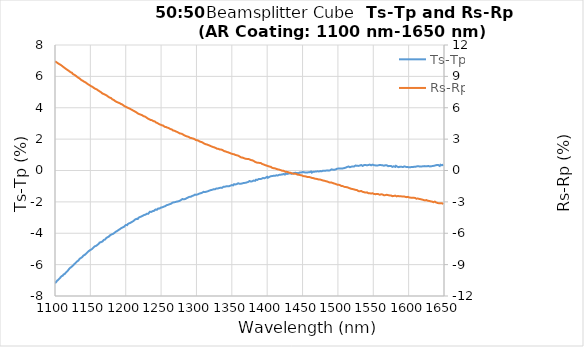
| Category | Ts-Tp |
|---|---|
| 1100.0 | -7.181 |
| 1101.0 | -7.12 |
| 1102.0 | -7.091 |
| 1103.0 | -7.024 |
| 1104.0 | -6.999 |
| 1105.0 | -6.949 |
| 1106.0 | -6.905 |
| 1107.0 | -6.854 |
| 1108.0 | -6.821 |
| 1109.0 | -6.749 |
| 1110.0 | -6.731 |
| 1111.0 | -6.701 |
| 1112.0 | -6.631 |
| 1113.0 | -6.587 |
| 1114.0 | -6.583 |
| 1115.0 | -6.534 |
| 1116.0 | -6.476 |
| 1117.0 | -6.419 |
| 1118.0 | -6.394 |
| 1119.0 | -6.329 |
| 1120.0 | -6.272 |
| 1121.0 | -6.224 |
| 1122.0 | -6.2 |
| 1123.0 | -6.152 |
| 1124.0 | -6.115 |
| 1125.0 | -6.078 |
| 1126.0 | -6.027 |
| 1127.0 | -5.98 |
| 1128.0 | -5.933 |
| 1129.0 | -5.894 |
| 1130.0 | -5.882 |
| 1131.0 | -5.801 |
| 1132.0 | -5.775 |
| 1133.0 | -5.74 |
| 1134.0 | -5.687 |
| 1135.0 | -5.621 |
| 1136.0 | -5.635 |
| 1137.0 | -5.566 |
| 1138.0 | -5.533 |
| 1139.0 | -5.495 |
| 1140.0 | -5.429 |
| 1141.0 | -5.442 |
| 1142.0 | -5.382 |
| 1143.0 | -5.327 |
| 1144.0 | -5.296 |
| 1145.0 | -5.272 |
| 1146.0 | -5.21 |
| 1147.0 | -5.191 |
| 1148.0 | -5.127 |
| 1149.0 | -5.111 |
| 1150.0 | -5.066 |
| 1151.0 | -5.056 |
| 1152.0 | -5.015 |
| 1153.0 | -4.983 |
| 1154.0 | -4.93 |
| 1155.0 | -4.907 |
| 1156.0 | -4.84 |
| 1157.0 | -4.824 |
| 1158.0 | -4.806 |
| 1159.0 | -4.766 |
| 1160.0 | -4.74 |
| 1161.0 | -4.686 |
| 1162.0 | -4.665 |
| 1163.0 | -4.595 |
| 1164.0 | -4.582 |
| 1165.0 | -4.568 |
| 1166.0 | -4.535 |
| 1167.0 | -4.527 |
| 1168.0 | -4.47 |
| 1169.0 | -4.428 |
| 1170.0 | -4.404 |
| 1171.0 | -4.391 |
| 1172.0 | -4.327 |
| 1173.0 | -4.27 |
| 1174.0 | -4.257 |
| 1175.0 | -4.228 |
| 1176.0 | -4.215 |
| 1177.0 | -4.184 |
| 1178.0 | -4.124 |
| 1179.0 | -4.132 |
| 1180.0 | -4.074 |
| 1181.0 | -4.052 |
| 1182.0 | -4.042 |
| 1183.0 | -3.989 |
| 1184.0 | -3.976 |
| 1185.0 | -3.946 |
| 1186.0 | -3.903 |
| 1187.0 | -3.876 |
| 1188.0 | -3.851 |
| 1189.0 | -3.81 |
| 1190.0 | -3.787 |
| 1191.0 | -3.765 |
| 1192.0 | -3.728 |
| 1193.0 | -3.681 |
| 1194.0 | -3.665 |
| 1195.0 | -3.632 |
| 1196.0 | -3.619 |
| 1197.0 | -3.571 |
| 1198.0 | -3.574 |
| 1199.0 | -3.565 |
| 1200.0 | -3.473 |
| 1201.0 | -3.476 |
| 1202.0 | -3.482 |
| 1203.0 | -3.412 |
| 1204.0 | -3.391 |
| 1205.0 | -3.365 |
| 1206.0 | -3.327 |
| 1207.0 | -3.327 |
| 1208.0 | -3.288 |
| 1209.0 | -3.269 |
| 1210.0 | -3.25 |
| 1211.0 | -3.221 |
| 1212.0 | -3.182 |
| 1213.0 | -3.135 |
| 1214.0 | -3.15 |
| 1215.0 | -3.082 |
| 1216.0 | -3.076 |
| 1217.0 | -3.091 |
| 1218.0 | -3.01 |
| 1219.0 | -3.039 |
| 1220.0 | -2.97 |
| 1221.0 | -2.963 |
| 1222.0 | -2.932 |
| 1223.0 | -2.921 |
| 1224.0 | -2.885 |
| 1225.0 | -2.877 |
| 1226.0 | -2.835 |
| 1227.0 | -2.81 |
| 1228.0 | -2.814 |
| 1229.0 | -2.791 |
| 1230.0 | -2.751 |
| 1231.0 | -2.765 |
| 1232.0 | -2.755 |
| 1233.0 | -2.702 |
| 1234.0 | -2.632 |
| 1235.0 | -2.645 |
| 1236.0 | -2.641 |
| 1237.0 | -2.606 |
| 1238.0 | -2.59 |
| 1239.0 | -2.578 |
| 1240.0 | -2.572 |
| 1241.0 | -2.535 |
| 1242.0 | -2.486 |
| 1243.0 | -2.453 |
| 1244.0 | -2.503 |
| 1245.0 | -2.454 |
| 1246.0 | -2.416 |
| 1247.0 | -2.385 |
| 1248.0 | -2.415 |
| 1249.0 | -2.379 |
| 1250.0 | -2.359 |
| 1251.0 | -2.317 |
| 1252.0 | -2.345 |
| 1253.0 | -2.293 |
| 1254.0 | -2.301 |
| 1255.0 | -2.265 |
| 1256.0 | -2.269 |
| 1257.0 | -2.231 |
| 1258.0 | -2.209 |
| 1259.0 | -2.211 |
| 1260.0 | -2.184 |
| 1261.0 | -2.155 |
| 1262.0 | -2.148 |
| 1263.0 | -2.12 |
| 1264.0 | -2.121 |
| 1265.0 | -2.089 |
| 1266.0 | -2.054 |
| 1267.0 | -2.097 |
| 1268.0 | -2.03 |
| 1269.0 | -2.046 |
| 1270.0 | -2.014 |
| 1271.0 | -1.981 |
| 1272.0 | -1.983 |
| 1273.0 | -1.998 |
| 1274.0 | -1.965 |
| 1275.0 | -1.928 |
| 1276.0 | -1.941 |
| 1277.0 | -1.884 |
| 1278.0 | -1.887 |
| 1279.0 | -1.88 |
| 1280.0 | -1.82 |
| 1281.0 | -1.826 |
| 1282.0 | -1.832 |
| 1283.0 | -1.831 |
| 1284.0 | -1.82 |
| 1285.0 | -1.764 |
| 1286.0 | -1.767 |
| 1287.0 | -1.767 |
| 1288.0 | -1.72 |
| 1289.0 | -1.707 |
| 1290.0 | -1.682 |
| 1291.0 | -1.672 |
| 1292.0 | -1.677 |
| 1293.0 | -1.658 |
| 1294.0 | -1.619 |
| 1295.0 | -1.607 |
| 1296.0 | -1.593 |
| 1297.0 | -1.55 |
| 1298.0 | -1.536 |
| 1299.0 | -1.544 |
| 1300.0 | -1.549 |
| 1301.0 | -1.539 |
| 1302.0 | -1.518 |
| 1303.0 | -1.49 |
| 1304.0 | -1.47 |
| 1305.0 | -1.435 |
| 1306.0 | -1.449 |
| 1307.0 | -1.459 |
| 1308.0 | -1.419 |
| 1309.0 | -1.388 |
| 1310.0 | -1.359 |
| 1311.0 | -1.373 |
| 1312.0 | -1.376 |
| 1313.0 | -1.359 |
| 1314.0 | -1.351 |
| 1315.0 | -1.338 |
| 1316.0 | -1.322 |
| 1317.0 | -1.291 |
| 1318.0 | -1.289 |
| 1319.0 | -1.282 |
| 1320.0 | -1.251 |
| 1321.0 | -1.251 |
| 1322.0 | -1.234 |
| 1323.0 | -1.218 |
| 1324.0 | -1.199 |
| 1325.0 | -1.197 |
| 1326.0 | -1.198 |
| 1327.0 | -1.189 |
| 1328.0 | -1.15 |
| 1329.0 | -1.166 |
| 1330.0 | -1.151 |
| 1331.0 | -1.113 |
| 1332.0 | -1.118 |
| 1333.0 | -1.087 |
| 1334.0 | -1.1 |
| 1335.0 | -1.075 |
| 1336.0 | -1.109 |
| 1337.0 | -1.071 |
| 1338.0 | -1.042 |
| 1339.0 | -1.047 |
| 1340.0 | -1.033 |
| 1341.0 | -1.033 |
| 1342.0 | -1.012 |
| 1343.0 | -1.03 |
| 1344.0 | -0.999 |
| 1345.0 | -0.979 |
| 1346.0 | -1.001 |
| 1347.0 | -1.013 |
| 1348.0 | -0.969 |
| 1349.0 | -0.963 |
| 1350.0 | -0.928 |
| 1351.0 | -0.904 |
| 1352.0 | -0.944 |
| 1353.0 | -0.876 |
| 1354.0 | -0.885 |
| 1355.0 | -0.89 |
| 1356.0 | -0.889 |
| 1357.0 | -0.866 |
| 1358.0 | -0.841 |
| 1359.0 | -0.812 |
| 1360.0 | -0.84 |
| 1361.0 | -0.847 |
| 1362.0 | -0.82 |
| 1363.0 | -0.844 |
| 1364.0 | -0.811 |
| 1365.0 | -0.82 |
| 1366.0 | -0.786 |
| 1367.0 | -0.793 |
| 1368.0 | -0.779 |
| 1369.0 | -0.786 |
| 1370.0 | -0.796 |
| 1371.0 | -0.763 |
| 1372.0 | -0.734 |
| 1373.0 | -0.731 |
| 1374.0 | -0.749 |
| 1375.0 | -0.67 |
| 1376.0 | -0.703 |
| 1377.0 | -0.703 |
| 1378.0 | -0.701 |
| 1379.0 | -0.687 |
| 1380.0 | -0.661 |
| 1381.0 | -0.639 |
| 1382.0 | -0.637 |
| 1383.0 | -0.657 |
| 1384.0 | -0.59 |
| 1385.0 | -0.6 |
| 1386.0 | -0.602 |
| 1387.0 | -0.586 |
| 1388.0 | -0.545 |
| 1389.0 | -0.576 |
| 1390.0 | -0.548 |
| 1391.0 | -0.581 |
| 1392.0 | -0.531 |
| 1393.0 | -0.502 |
| 1394.0 | -0.477 |
| 1395.0 | -0.518 |
| 1396.0 | -0.496 |
| 1397.0 | -0.462 |
| 1398.0 | -0.456 |
| 1399.0 | -0.419 |
| 1400.0 | -0.399 |
| 1401.0 | -0.464 |
| 1402.0 | -0.411 |
| 1403.0 | -0.411 |
| 1404.0 | -0.429 |
| 1405.0 | -0.364 |
| 1406.0 | -0.376 |
| 1407.0 | -0.356 |
| 1408.0 | -0.368 |
| 1409.0 | -0.338 |
| 1410.0 | -0.347 |
| 1411.0 | -0.34 |
| 1412.0 | -0.333 |
| 1413.0 | -0.307 |
| 1414.0 | -0.319 |
| 1415.0 | -0.315 |
| 1416.0 | -0.296 |
| 1417.0 | -0.278 |
| 1418.0 | -0.252 |
| 1419.0 | -0.266 |
| 1420.0 | -0.235 |
| 1421.0 | -0.258 |
| 1422.0 | -0.246 |
| 1423.0 | -0.224 |
| 1424.0 | -0.237 |
| 1425.0 | -0.261 |
| 1426.0 | -0.188 |
| 1427.0 | -0.228 |
| 1428.0 | -0.222 |
| 1429.0 | -0.219 |
| 1430.0 | -0.197 |
| 1431.0 | -0.203 |
| 1432.0 | -0.175 |
| 1433.0 | -0.204 |
| 1434.0 | -0.202 |
| 1435.0 | -0.187 |
| 1436.0 | -0.197 |
| 1437.0 | -0.187 |
| 1438.0 | -0.156 |
| 1439.0 | -0.167 |
| 1440.0 | -0.147 |
| 1441.0 | -0.158 |
| 1442.0 | -0.158 |
| 1443.0 | -0.157 |
| 1444.0 | -0.175 |
| 1445.0 | -0.146 |
| 1446.0 | -0.131 |
| 1447.0 | -0.121 |
| 1448.0 | -0.131 |
| 1449.0 | -0.15 |
| 1450.0 | -0.096 |
| 1451.0 | -0.102 |
| 1452.0 | -0.108 |
| 1453.0 | -0.135 |
| 1454.0 | -0.134 |
| 1455.0 | -0.14 |
| 1456.0 | -0.134 |
| 1457.0 | -0.126 |
| 1458.0 | -0.115 |
| 1459.0 | -0.125 |
| 1460.0 | -0.105 |
| 1461.0 | -0.095 |
| 1462.0 | -0.063 |
| 1463.0 | -0.136 |
| 1464.0 | -0.119 |
| 1465.0 | -0.084 |
| 1466.0 | -0.104 |
| 1467.0 | -0.074 |
| 1468.0 | -0.076 |
| 1469.0 | -0.068 |
| 1470.0 | -0.073 |
| 1471.0 | -0.051 |
| 1472.0 | -0.092 |
| 1473.0 | -0.059 |
| 1474.0 | -0.041 |
| 1475.0 | -0.037 |
| 1476.0 | -0.028 |
| 1477.0 | -0.051 |
| 1478.0 | -0.05 |
| 1479.0 | -0.01 |
| 1480.0 | -0.035 |
| 1481.0 | -0.015 |
| 1482.0 | -0.003 |
| 1483.0 | -0.008 |
| 1484.0 | -0.017 |
| 1485.0 | 0.008 |
| 1486.0 | 0.02 |
| 1487.0 | -0.009 |
| 1488.0 | 0.015 |
| 1489.0 | 0.01 |
| 1490.0 | 0.022 |
| 1491.0 | 0.075 |
| 1492.0 | 0.054 |
| 1493.0 | 0.05 |
| 1494.0 | 0.076 |
| 1495.0 | 0.045 |
| 1496.0 | 0.031 |
| 1497.0 | 0.07 |
| 1498.0 | 0.075 |
| 1499.0 | 0.116 |
| 1500.0 | 0.132 |
| 1501.0 | 0.125 |
| 1502.0 | 0.108 |
| 1503.0 | 0.127 |
| 1504.0 | 0.157 |
| 1505.0 | 0.12 |
| 1506.0 | 0.149 |
| 1507.0 | 0.134 |
| 1508.0 | 0.18 |
| 1509.0 | 0.155 |
| 1510.0 | 0.185 |
| 1511.0 | 0.181 |
| 1512.0 | 0.192 |
| 1513.0 | 0.225 |
| 1514.0 | 0.175 |
| 1515.0 | 0.257 |
| 1516.0 | 0.195 |
| 1517.0 | 0.209 |
| 1518.0 | 0.262 |
| 1519.0 | 0.244 |
| 1520.0 | 0.269 |
| 1521.0 | 0.259 |
| 1522.0 | 0.279 |
| 1523.0 | 0.257 |
| 1524.0 | 0.301 |
| 1525.0 | 0.318 |
| 1526.0 | 0.282 |
| 1527.0 | 0.298 |
| 1528.0 | 0.274 |
| 1529.0 | 0.293 |
| 1530.0 | 0.336 |
| 1531.0 | 0.316 |
| 1532.0 | 0.304 |
| 1533.0 | 0.348 |
| 1534.0 | 0.302 |
| 1535.0 | 0.294 |
| 1536.0 | 0.352 |
| 1537.0 | 0.344 |
| 1538.0 | 0.329 |
| 1539.0 | 0.349 |
| 1540.0 | 0.363 |
| 1541.0 | 0.333 |
| 1542.0 | 0.362 |
| 1543.0 | 0.347 |
| 1544.0 | 0.365 |
| 1545.0 | 0.375 |
| 1546.0 | 0.317 |
| 1547.0 | 0.33 |
| 1548.0 | 0.357 |
| 1549.0 | 0.373 |
| 1550.0 | 0.383 |
| 1551.0 | 0.336 |
| 1552.0 | 0.352 |
| 1553.0 | 0.326 |
| 1554.0 | 0.345 |
| 1555.0 | 0.316 |
| 1556.0 | 0.365 |
| 1557.0 | 0.329 |
| 1558.0 | 0.347 |
| 1559.0 | 0.352 |
| 1560.0 | 0.305 |
| 1561.0 | 0.344 |
| 1562.0 | 0.333 |
| 1563.0 | 0.335 |
| 1564.0 | 0.347 |
| 1565.0 | 0.304 |
| 1566.0 | 0.307 |
| 1567.0 | 0.332 |
| 1568.0 | 0.286 |
| 1569.0 | 0.333 |
| 1570.0 | 0.278 |
| 1571.0 | 0.277 |
| 1572.0 | 0.288 |
| 1573.0 | 0.288 |
| 1574.0 | 0.263 |
| 1575.0 | 0.29 |
| 1576.0 | 0.29 |
| 1577.0 | 0.231 |
| 1578.0 | 0.269 |
| 1579.0 | 0.271 |
| 1580.0 | 0.276 |
| 1581.0 | 0.23 |
| 1582.0 | 0.296 |
| 1583.0 | 0.245 |
| 1584.0 | 0.245 |
| 1585.0 | 0.27 |
| 1586.0 | 0.213 |
| 1587.0 | 0.26 |
| 1588.0 | 0.245 |
| 1589.0 | 0.218 |
| 1590.0 | 0.235 |
| 1591.0 | 0.232 |
| 1592.0 | 0.22 |
| 1593.0 | 0.267 |
| 1594.0 | 0.262 |
| 1595.0 | 0.217 |
| 1596.0 | 0.232 |
| 1597.0 | 0.209 |
| 1598.0 | 0.224 |
| 1599.0 | 0.258 |
| 1600.0 | 0.21 |
| 1601.0 | 0.239 |
| 1602.0 | 0.205 |
| 1603.0 | 0.231 |
| 1604.0 | 0.222 |
| 1605.0 | 0.222 |
| 1606.0 | 0.216 |
| 1607.0 | 0.234 |
| 1608.0 | 0.245 |
| 1609.0 | 0.251 |
| 1610.0 | 0.242 |
| 1611.0 | 0.228 |
| 1612.0 | 0.269 |
| 1613.0 | 0.236 |
| 1614.0 | 0.27 |
| 1615.0 | 0.26 |
| 1616.0 | 0.25 |
| 1617.0 | 0.268 |
| 1618.0 | 0.259 |
| 1619.0 | 0.267 |
| 1620.0 | 0.264 |
| 1621.0 | 0.243 |
| 1622.0 | 0.28 |
| 1623.0 | 0.218 |
| 1624.0 | 0.271 |
| 1625.0 | 0.263 |
| 1626.0 | 0.274 |
| 1627.0 | 0.292 |
| 1628.0 | 0.285 |
| 1629.0 | 0.32 |
| 1630.0 | 0.257 |
| 1631.0 | 0.286 |
| 1632.0 | 0.273 |
| 1633.0 | 0.312 |
| 1634.0 | 0.284 |
| 1635.0 | 0.308 |
| 1636.0 | 0.302 |
| 1637.0 | 0.316 |
| 1638.0 | 0.329 |
| 1639.0 | 0.309 |
| 1640.0 | 0.351 |
| 1641.0 | 0.337 |
| 1642.0 | 0.344 |
| 1643.0 | 0.335 |
| 1644.0 | 0.288 |
| 1645.0 | 0.369 |
| 1646.0 | 0.365 |
| 1647.0 | 0.332 |
| 1648.0 | 0.338 |
| 1649.0 | 0.376 |
| 1650.0 | 0.34 |